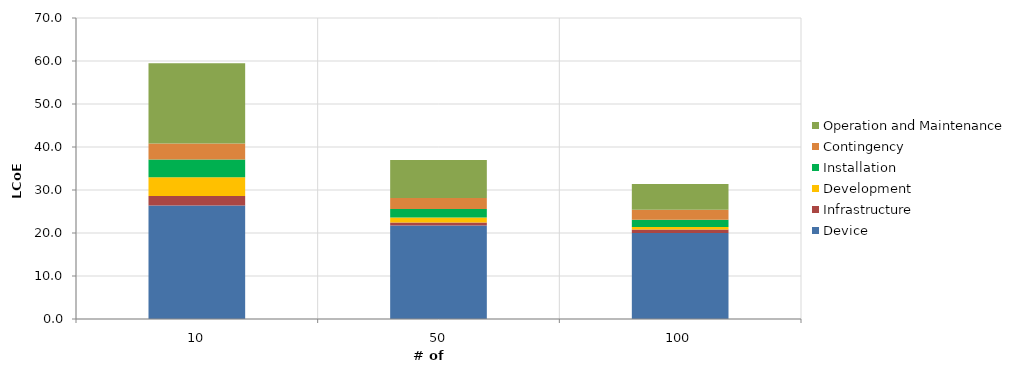
| Category | Device | Infrastructure | Development | Installation | Contingency | Operation and Maintenance |
|---|---|---|---|---|---|---|
| 10.0 | 26.41 | 2.211 | 4.335 | 4.132 | 3.709 | 18.657 |
| 50.0 | 21.755 | 0.688 | 1.167 | 1.959 | 2.557 | 8.867 |
| 100.0 | 20.019 | 0.788 | 0.561 | 1.723 | 2.309 | 5.999 |